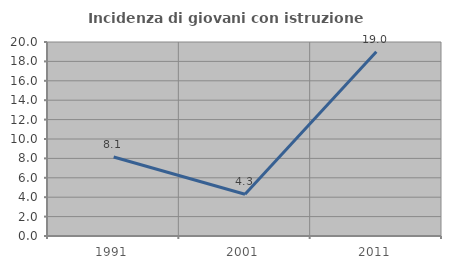
| Category | Incidenza di giovani con istruzione universitaria |
|---|---|
| 1991.0 | 8.14 |
| 2001.0 | 4.31 |
| 2011.0 | 18.987 |